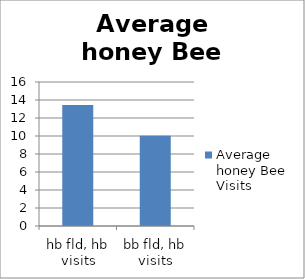
| Category | Average honey Bee Visits |
|---|---|
| hb fld, hb visits | 13.457 |
| bb fld, hb visits | 10.028 |